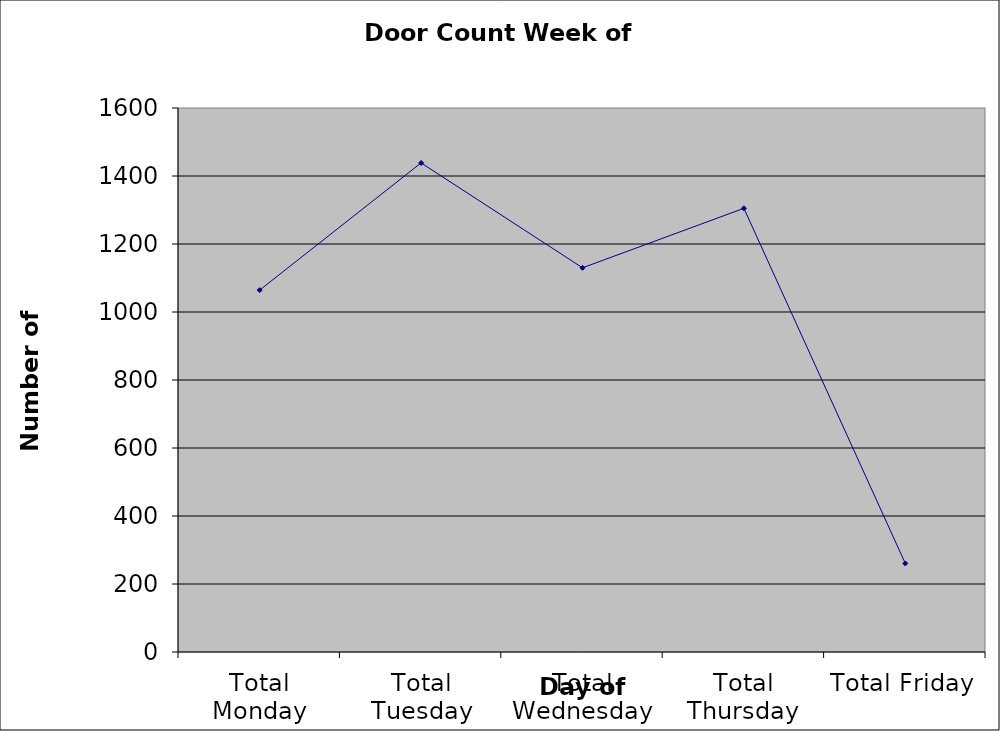
| Category | Series 0 |
|---|---|
| Total Monday | 1064.5 |
| Total Tuesday | 1438.5 |
| Total Wednesday | 1130 |
| Total Thursday | 1305 |
| Total Friday | 260.5 |